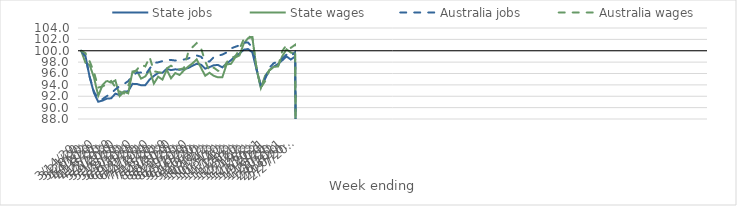
| Category | State jobs | State wages | Australia jobs | Australia wages |
|---|---|---|---|---|
| 14/03/2020 | 100 | 100 | 100 | 100 |
| 21/03/2020 | 99.129 | 97.918 | 98.956 | 99.591 |
| 28/03/2020 | 95.342 | 97.462 | 95.412 | 98.115 |
| 04/04/2020 | 92.565 | 95.303 | 92.813 | 96.238 |
| 11/04/2020 | 91.035 | 92.088 | 91.52 | 93.527 |
| 18/04/2020 | 91.242 | 93.969 | 91.497 | 93.722 |
| 25/04/2020 | 91.584 | 94.725 | 92.022 | 94.132 |
| 02/05/2020 | 91.636 | 94.365 | 92.516 | 94.683 |
| 09/05/2020 | 92.453 | 94.791 | 93.196 | 93.606 |
| 16/05/2020 | 92.204 | 92.032 | 93.786 | 92.839 |
| 23/05/2020 | 92.813 | 92.795 | 94.143 | 92.495 |
| 30/05/2020 | 92.871 | 92.506 | 94.652 | 93.805 |
| 06/06/2020 | 94.179 | 96.348 | 95.638 | 95.989 |
| 13/06/2020 | 94.158 | 96.496 | 96.141 | 96.647 |
| 20/06/2020 | 93.94 | 95.104 | 96.161 | 97.556 |
| 27/06/2020 | 93.948 | 95.493 | 95.749 | 97.243 |
| 04/07/2020 | 94.937 | 96.631 | 96.855 | 98.903 |
| 11/07/2020 | 95.569 | 94.226 | 97.864 | 96.396 |
| 18/07/2020 | 96.101 | 95.443 | 97.96 | 96.236 |
| 25/07/2020 | 96.14 | 94.925 | 98.177 | 96.05 |
| 01/08/2020 | 96.824 | 96.678 | 98.391 | 96.89 |
| 08/08/2020 | 96.592 | 95.161 | 98.384 | 97.377 |
| 15/08/2020 | 96.738 | 96.079 | 98.275 | 96.882 |
| 22/08/2020 | 96.659 | 95.74 | 98.328 | 96.723 |
| 29/08/2020 | 96.766 | 96.532 | 98.458 | 96.942 |
| 05/09/2020 | 96.951 | 97.202 | 98.618 | 99.637 |
| 12/09/2020 | 97.35 | 97.76 | 99.017 | 100.615 |
| 19/09/2020 | 97.71 | 98.495 | 99.166 | 101.346 |
| 26/09/2020 | 97.561 | 97.014 | 98.953 | 100.497 |
| 03/10/2020 | 96.855 | 95.598 | 98.095 | 98.1 |
| 10/10/2020 | 97.124 | 96.129 | 98.121 | 96.45 |
| 17/10/2020 | 97.451 | 95.586 | 98.87 | 97.028 |
| 24/10/2020 | 97.495 | 95.321 | 99.128 | 96.463 |
| 31/10/2020 | 97.076 | 95.329 | 99.332 | 96.583 |
| 07/11/2020 | 97.76 | 97.611 | 99.7 | 97.947 |
| 14/11/2020 | 98.329 | 97.687 | 100.404 | 98.872 |
| 21/11/2020 | 99.05 | 98.794 | 100.686 | 98.947 |
| 28/11/2020 | 99.498 | 99.187 | 100.954 | 100.289 |
| 05/12/2020 | 100.185 | 101.248 | 101.418 | 102.049 |
| 12/12/2020 | 100.302 | 102.202 | 101.44 | 102.491 |
| 19/12/2020 | 99.733 | 102.394 | 100.619 | 102.382 |
| 26/12/2020 | 96.65 | 96.854 | 96.814 | 96.897 |
| 02/01/2021 | 93.579 | 93.462 | 93.894 | 93.496 |
| 09/01/2021 | 95.178 | 95.603 | 95.102 | 94.672 |
| 16/01/2021 | 96.566 | 96.582 | 97.043 | 96.593 |
| 23/01/2021 | 97.198 | 97.167 | 97.81 | 97.069 |
| 30/01/2021 | 97.668 | 97.239 | 98.097 | 97.188 |
| 06/02/2021 | 98.313 | 99.047 | 98.579 | 99.942 |
| 13/02/2021 | 98.999 | 100.246 | 99.324 | 101.024 |
| 20/02/2021 | 98.454 | 99.682 | 98.998 | 100.508 |
| 27/02/2021 | 98.981 | 99.454 | 99.758 | 101.044 |